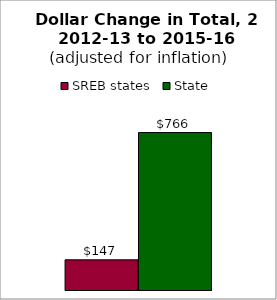
| Category | SREB states | State |
|---|---|---|
| 0 | 146.849 | 765.888 |